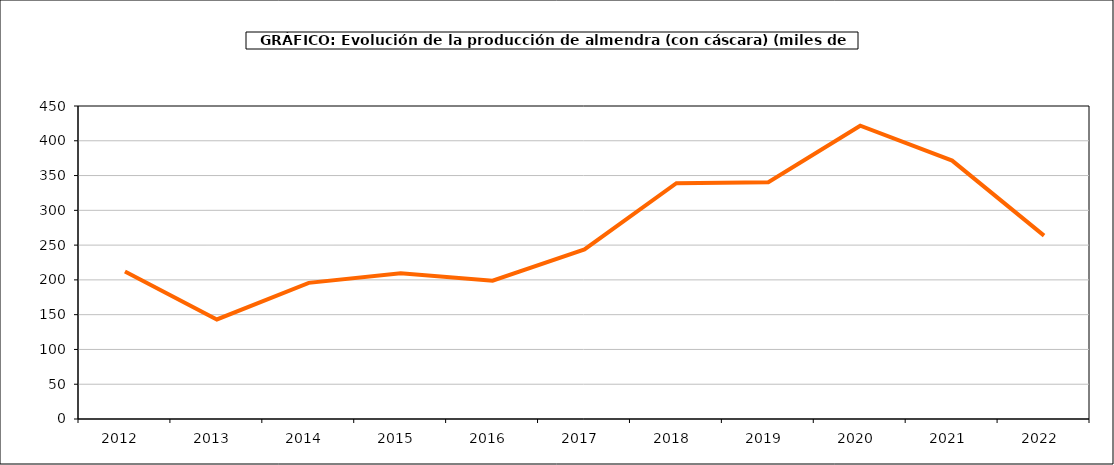
| Category | producción almendro |
|---|---|
| 2012.0 | 212.063 |
| 2013.0 | 143.081 |
| 2014.0 | 195.699 |
| 2015.0 | 209.443 |
| 2016.0 | 198.767 |
| 2017.0 | 243.876 |
| 2018.0 | 339.033 |
| 2019.0 | 340.421 |
| 2020.0 | 421.61 |
| 2021.0 | 371.46 |
| 2022.0 | 263.597 |